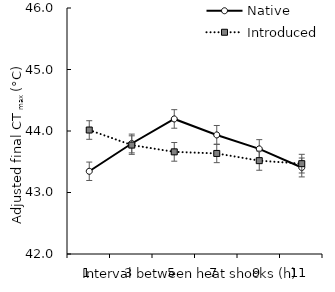
| Category | Native | Introduced |
|---|---|---|
| 1.0 | 43.345 | 44.016 |
| 3.0 | 43.797 | 43.771 |
| 5.0 | 44.196 | 43.661 |
| 7.0 | 43.936 | 43.635 |
| 9.0 | 43.709 | 43.518 |
| 11.0 | 43.407 | 43.469 |